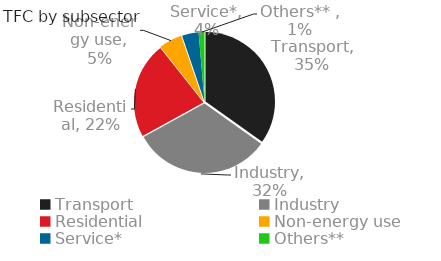
| Category | TFC by subsector |
|---|---|
| Transport | 54377.528 |
| Industry | 50156.934 |
| Residential | 34884.111 |
| Non-energy use | 8491.413 |
| Service* | 6028.195 |
| Others**  | 2117.357 |